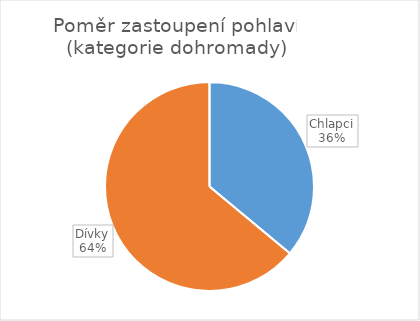
| Category | Series 0 |
|---|---|
| Chlapci | 40 |
| Dívky | 71 |